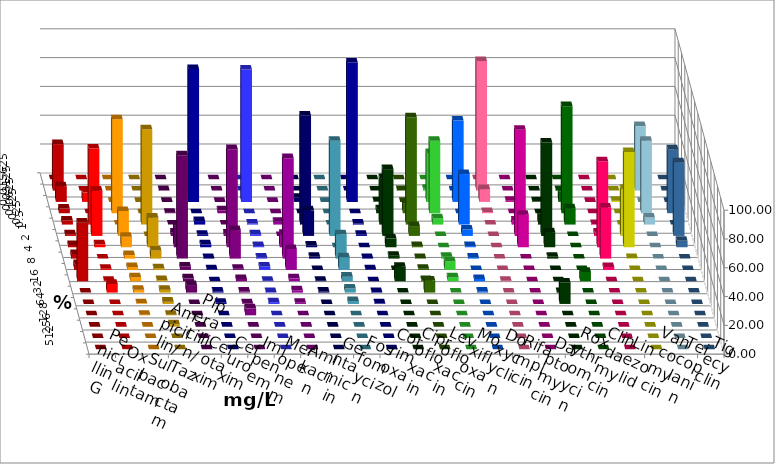
| Category | Penicillin G | Oxacillin | Ampicillin/ Sulbactam | Piperacillin/ Tazobactam | Cefotaxim | Cefuroxim | Imipenem | Meropenem | Amikacin | Gentamicin | Fosfomycin | Cotrimoxazol | Ciprofloxacin | Levofloxacin | Moxifloxacin | Doxycyclin | Rifampicin | Daptomycin | Roxythromycin | Clindamycin | Linezolid | Vancomycin | Teicoplanin | Tigecyclin |
|---|---|---|---|---|---|---|---|---|---|---|---|---|---|---|---|---|---|---|---|---|---|---|---|---|
| 0.015625 | 0 | 0 | 0 | 0 | 0 | 0 | 0 | 0 | 0 | 0 | 0 | 0 | 0 | 0 | 0 | 0 | 0 | 0 | 0 | 0 | 0 | 0 | 0 | 0 |
| 0.03125 | 32.258 | 0 | 0 | 0 | 0.403 | 0 | 0 | 0 | 0 | 0 | 0 | 0 | 0 | 0.403 | 1.21 | 0 | 89.919 | 0 | 0 | 0.407 | 0 | 0 | 0 | 44.758 |
| 0.0625 | 10.887 | 6.452 | 0 | 0 | 0 | 0 | 92.339 | 91.935 | 0 | 2.823 | 0 | 96.774 | 0.403 | 0 | 33.871 | 56.452 | 8.871 | 0.806 | 0.403 | 7.317 | 0 | 0.806 | 0 | 0 |
| 0.125 | 3.226 | 0 | 65.323 | 0 | 0.403 | 2.016 | 0 | 0 | 0 | 0 | 0 | 0 | 2.823 | 6.855 | 50.403 | 0 | 0.806 | 0 | 0 | 74.39 | 0 | 0 | 44.355 | 50.403 |
| 0.25 | 2.823 | 52.823 | 0 | 66.129 | 0 | 0 | 2.419 | 0.806 | 2.016 | 75.806 | 0 | 0.806 | 32.258 | 74.597 | 4.435 | 35.081 | 0 | 2.823 | 7.661 | 11.382 | 0.403 | 0 | 0 | 4.839 |
| 0.5 | 1.21 | 31.452 | 17.339 | 0 | 2.419 | 1.613 | 0.806 | 1.21 | 0 | 17.742 | 66.129 | 0.806 | 46.371 | 6.855 | 0 | 4.435 | 0 | 73.79 | 64.919 | 0 | 2.419 | 32.661 | 51.21 | 0 |
| 1.0 | 1.613 | 2.016 | 7.258 | 20.565 | 15.323 | 68.145 | 2.016 | 0.806 | 9.274 | 1.21 | 0 | 0 | 6.048 | 0.806 | 0 | 0.806 | 0 | 22.581 | 10.484 | 0 | 59.677 | 66.129 | 4.435 | 0 |
| 2.0 | 3.226 | 0 | 2.419 | 5.645 | 71.774 | 19.758 | 0.403 | 0.806 | 69.758 | 1.21 | 16.935 | 0.403 | 2.016 | 0.403 | 1.21 | 0.806 | 0 | 0 | 1.21 | 0 | 35.484 | 0.403 | 0 | 0 |
| 4.0 | 4.032 | 0.806 | 2.016 | 1.21 | 2.419 | 0.806 | 0.403 | 2.419 | 14.516 | 0 | 8.871 | 0.403 | 0 | 0.806 | 6.048 | 0 | 0 | 0 | 0 | 0 | 2.016 | 0 | 0 | 0 |
| 8.0 | 40.726 | 0.403 | 2.823 | 0.806 | 2.016 | 1.613 | 0 | 0.403 | 2.016 | 0.403 | 3.226 | 0 | 10.081 | 0.806 | 2.823 | 1.613 | 0.403 | 0 | 0 | 6.504 | 0 | 0 | 0 | 0 |
| 16.0 | 0 | 6.048 | 2.016 | 2.016 | 5.242 | 0.806 | 0.806 | 0.403 | 1.613 | 0.806 | 2.823 | 0.403 | 0 | 8.468 | 0 | 0.806 | 0 | 0 | 0.403 | 0 | 0 | 0 | 0 | 0 |
| 32.0 | 0 | 0 | 0.403 | 1.613 | 0 | 0.403 | 0.806 | 1.21 | 0.806 | 0 | 2.016 | 0.403 | 0 | 0 | 0 | 0 | 0 | 0 | 14.919 | 0 | 0 | 0 | 0 | 0 |
| 64.0 | 0 | 0 | 0.403 | 0.403 | 0 | 4.839 | 0 | 0 | 0 | 0 | 0 | 0 | 0 | 0 | 0 | 0 | 0 | 0 | 0 | 0 | 0 | 0 | 0 | 0 |
| 128.0 | 0 | 0 | 0 | 1.613 | 0 | 0 | 0 | 0 | 0 | 0 | 0 | 0 | 0 | 0 | 0 | 0 | 0 | 0 | 0 | 0 | 0 | 0 | 0 | 0 |
| 256.0 | 0 | 0 | 0 | 0 | 0 | 0 | 0 | 0 | 0 | 0 | 0 | 0 | 0 | 0 | 0 | 0 | 0 | 0 | 0 | 0 | 0 | 0 | 0 | 0 |
| 512.0 | 0 | 0 | 0 | 0 | 0 | 0 | 0 | 0 | 0 | 0 | 0 | 0 | 0 | 0 | 0 | 0 | 0 | 0 | 0 | 0 | 0 | 0 | 0 | 0 |